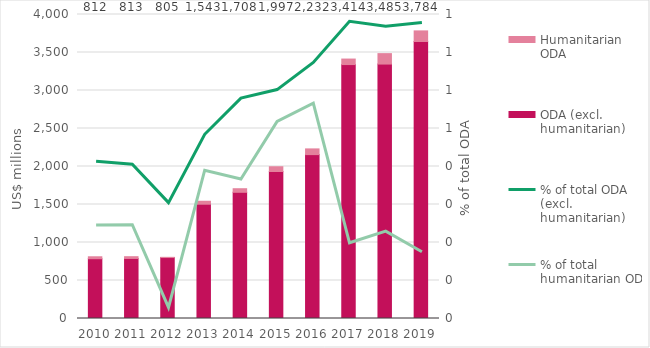
| Category | ODA (excl. humanitarian) | Humanitarian ODA |
|---|---|---|
| 2010.0 | 786.561 | 25.629 |
| 2011.0 | 790.163 | 23.239 |
| 2012.0 | 801.974 | 2.788 |
| 2013.0 | 1503.724 | 38.924 |
| 2014.0 | 1660.582 | 47.18 |
| 2015.0 | 1934.339 | 62.487 |
| 2016.0 | 2156.417 | 75.209 |
| 2017.0 | 3341.33 | 72.433 |
| 2018.0 | 3347.79 | 137.318 |
| 2019.0 | 3644.644 | 139.62 |